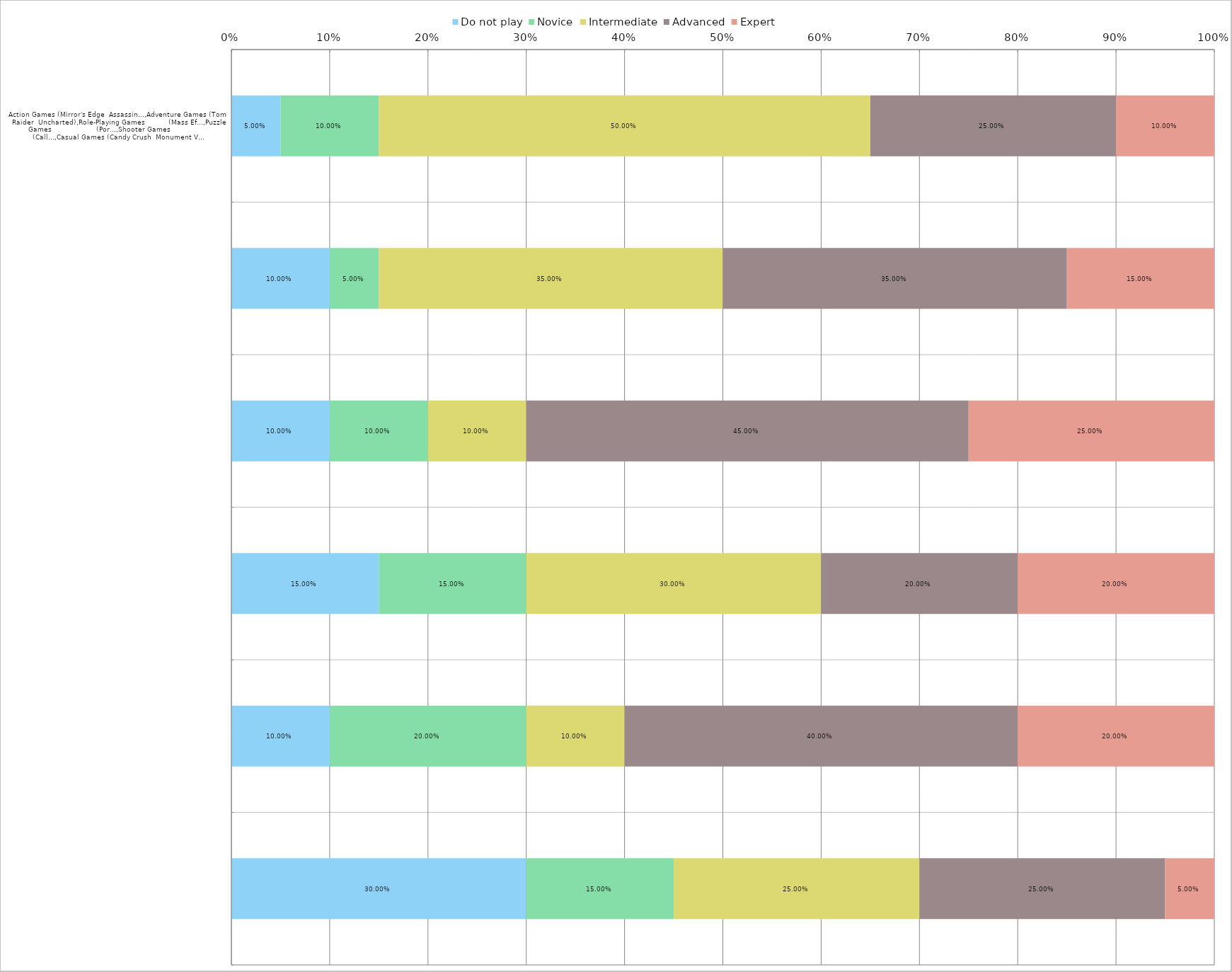
| Category | Do not play | Novice | Intermediate | Advanced | Expert |
|---|---|---|---|---|---|
| 0 | 0.05 | 0.1 | 0.5 | 0.25 | 0.1 |
| 1 | 0.1 | 0.05 | 0.35 | 0.35 | 0.15 |
| 2 | 0.1 | 0.1 | 0.1 | 0.45 | 0.25 |
| 3 | 0.15 | 0.15 | 0.3 | 0.2 | 0.2 |
| 4 | 0.1 | 0.2 | 0.1 | 0.4 | 0.2 |
| 5 | 0.3 | 0.15 | 0.25 | 0.25 | 0.05 |